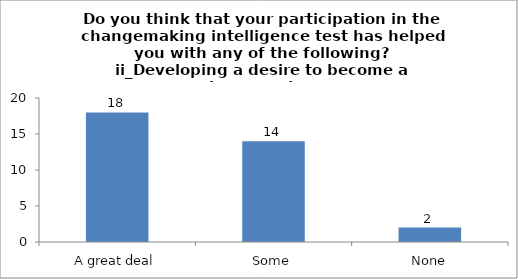
| Category | Do you think that your participation in the changemaking intelligence test has helped you with any of the following?
ii_Developing a desire to become a changemaker. |
|---|---|
| A great deal | 18 |
| Some | 14 |
| None | 2 |